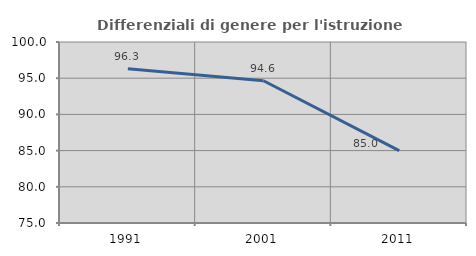
| Category | Differenziali di genere per l'istruzione superiore |
|---|---|
| 1991.0 | 96.309 |
| 2001.0 | 94.645 |
| 2011.0 | 85.007 |